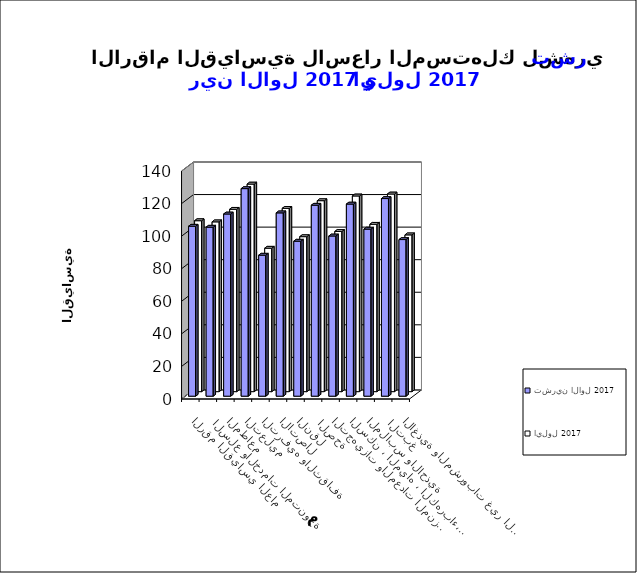
| Category | تشرين الاول 2017      | ايلول 2017       |
|---|---|---|
| الاغذية والمشروبات غير الكحولية | 96.2 | 96.3 |
|  التبغ | 121.4 | 121.4 |
| الملابس والاحذية | 102.6 | 102.8 |
| السكن ، المياه ، الكهرباء، الغاز  | 118 | 120.2 |
| التجهيزات والمعدات المنزلية والصيانة | 98.4 | 98.4 |
|  الصحة | 117.3 | 117.3 |
| النقل | 95.2 | 95.2 |
| الاتصال | 112.6 | 112.6 |
| الترفيه والثقافة | 86.6 | 88.1 |
| التعليم | 127.5 | 127.5 |
| المطاعم  | 111.9 | 112 |
|  السلع والخدمات المتنوعة | 103.8 | 104.3 |
| الرقم القياسي العام | 104.4 | 105 |